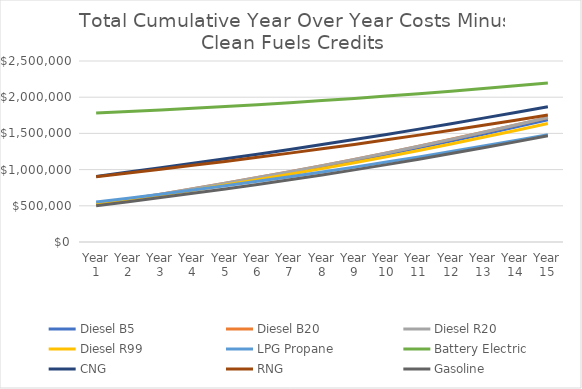
| Category | Diesel B5 | Diesel B20 | Diesel R20 | Diesel R99 | LPG Propane | Battery Electric | CNG | RNG | Gasoline |
|---|---|---|---|---|---|---|---|---|---|
| Year 1 | 519527.85 | 521686.468 | 521664.518 | 516866.546 | 552183.239 | 1780649.174 | 906407.075 | 899898.788 | 502125.635 |
| Year 2 | 585161.508 | 589461.061 | 589416.635 | 579732.934 | 605490.592 | 1801131.489 | 965359.678 | 952042.733 | 557318.737 |
| Year 3 | 654434.182 | 660856.562 | 660789.121 | 646129.829 | 660750.072 | 1822793.519 | 1025319.064 | 1004890.81 | 613801.909 |
| Year 4 | 726196.702 | 734723.367 | 734632.358 | 714905.454 | 718103.06 | 1845778.386 | 1086347.809 | 1058507.174 | 672165.605 |
| Year 5 | 800365.636 | 810977.598 | 810862.456 | 785973.713 | 777436.344 | 1870575.043 | 1149008.143 | 1113358.363 | 732293.246 |
| Year 6 | 877011.29 | 889689.108 | 889549.252 | 859402.18 | 838472.969 | 1896743.879 | 1213167.212 | 1169692.478 | 794376.241 |
| Year 7 | 956196.82 | 970920.582 | 970755.421 | 935251.215 | 901621.252 | 1924280.655 | 1278779.245 | 1227463.368 | 858971.473 |
| Year 8 | 1038027.083 | 1054776.403 | 1054585.328 | 1013622.812 | 966611.276 | 1953228.851 | 1345913.133 | 1286739.536 | 925887.476 |
| Year 9 | 1122329.164 | 1141083.165 | 1140865.555 | 1094341.123 | 1034377.98 | 1983647.878 | 1414609.49 | 1347561.197 | 996358.437 |
| Year 10 | 1210064.878 | 1230802.181 | 1230557.4 | 1178364.961 | 1104077.715 | 2015456.396 | 1486193.071 | 1411252.701 | 1068832.566 |
| Year 11 | 1300437.82 | 1323136.536 | 1322863.93 | 1264894.847 | 1175983.353 | 2048791.879 | 1559230.31 | 1476380.063 | 1143990.545 |
| Year 12 | 1393565.835 | 1418203.548 | 1417902.45 | 1354045.478 | 1249850.295 | 2083585.753 | 1634112.083 | 1543333.732 | 1221345.749 |
| Year 13 | 1489189.53 | 1515743.284 | 1515413.011 | 1445554.235 | 1325615.714 | 2119992.023 | 1710757.247 | 1612032.127 | 1301176.953 |
| Year 14 | 1587272.988 | 1615719.279 | 1615359.13 | 1539381.902 | 1403314.17 | 2157942.388 | 1789150.819 | 1682459.818 | 1383281.833 |
| Year 15 | 1687913.256 | 1718228.015 | 1717837.273 | 1635622.144 | 1483055.185 | 2197370.032 | 1869330.819 | 1754654.366 | 1467941.91 |